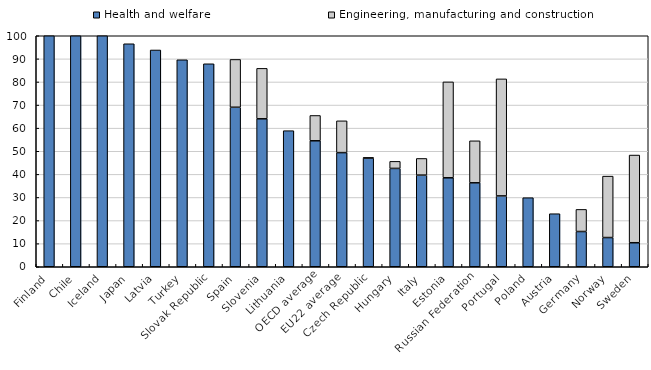
| Category | Health and welfare | Engineering, manufacturing and construction |
|---|---|---|
| Finland | 100 | 0 |
| Chile | 100 | 0 |
| Iceland | 100 | 0 |
| Japan | 96.531 | 0 |
| Latvia | 93.843 | 0 |
| Turkey | 89.599 | 0 |
| Slovak Republic | 87.868 | 0 |
| Spain | 69.044 | 20.705 |
| Slovenia | 64.048 | 21.838 |
| Lithuania | 58.908 | 0 |
| OECD average | 54.53 | 10.962 |
| EU22 average | 49.416 | 13.76 |
| Czech Republic | 47.087 | 0.107 |
| Hungary | 42.572 | 3.057 |
| Italy | 39.671 | 7.214 |
| Estonia | 38.51 | 41.521 |
| Russian Federation | 36.34 | 18.18 |
| Portugal | 30.667 | 50.661 |
| Poland | 29.895 | 0 |
| Austria | 22.962 | 0 |
| Germany | 15.257 | 9.569 |
| Norway | 12.643 | 26.595 |
| Sweden | 10.398 | 37.965 |